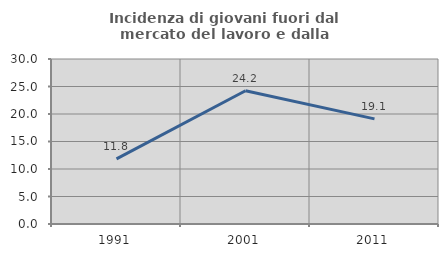
| Category | Incidenza di giovani fuori dal mercato del lavoro e dalla formazione  |
|---|---|
| 1991.0 | 11.844 |
| 2001.0 | 24.229 |
| 2011.0 | 19.108 |